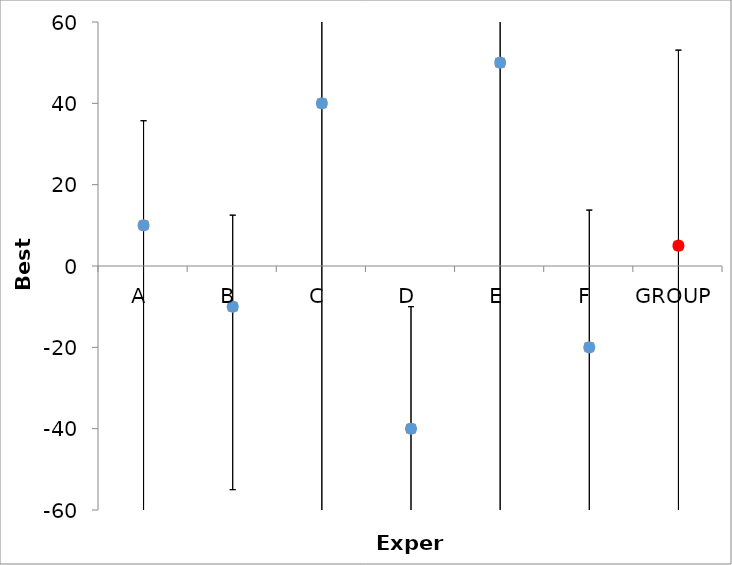
| Category | Series 1 | Series 0 |
|---|---|---|
| A | 10 | 10 |
| B | -10 | -10 |
| C | 40 | 40 |
| D | -40 | -40 |
| E | 50 | 50 |
| F | -20 | -20 |
| GROUP | 5 | 5 |